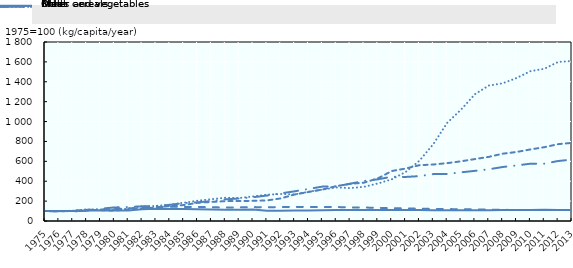
| Category | Rice | Other cereals | Meat | Fruits and vegetables | Milk |
|---|---|---|---|---|---|
| 1975.0 | 100 | 100 | 100 | 100 | 100 |
| 1976.0 | 99.717 | 100.924 | 97.703 | 97.95 | 101.478 |
| 1977.0 | 101.502 | 99.846 | 97.033 | 100.175 | 103.448 |
| 1978.0 | 106.602 | 113.177 | 103.541 | 109.499 | 117.241 |
| 1979.0 | 108.429 | 116.025 | 123.445 | 109.586 | 109.852 |
| 1980.0 | 106.757 | 121.367 | 136.268 | 104.399 | 114.778 |
| 1981.0 | 106.191 | 127.047 | 140.574 | 117.666 | 124.138 |
| 1982.0 | 119.04 | 132.466 | 147.847 | 122.538 | 145.32 |
| 1983.0 | 122.51 | 139.778 | 151.1 | 136.681 | 151.724 |
| 1984.0 | 121.632 | 143.504 | 162.297 | 150.456 | 164.039 |
| 1985.0 | 121.15 | 141.41 | 180.383 | 160.27 | 183.251 |
| 1986.0 | 118.785 | 141.21 | 187.56 | 183.246 | 203.941 |
| 1987.0 | 116.532 | 138.485 | 200.957 | 191.623 | 219.212 |
| 1988.0 | 113.614 | 135.422 | 218.182 | 199.597 | 233.99 |
| 1989.0 | 112.013 | 136.73 | 226.22 | 200.981 | 230.542 |
| 1990.0 | 115.824 | 139.763 | 238.852 | 202.489 | 247.291 |
| 1991.0 | 104.052 | 138.377 | 255.981 | 206.765 | 264.532 |
| 1992.0 | 104.236 | 140.302 | 277.512 | 227.234 | 271.429 |
| 1993.0 | 106.021 | 142.087 | 298.66 | 266.491 | 266.995 |
| 1994.0 | 106.403 | 141.241 | 322.297 | 291.781 | 294.581 |
| 1995.0 | 109.307 | 140.132 | 345.933 | 316.632 | 315.271 |
| 1996.0 | 109.789 | 140.81 | 348.517 | 350.403 | 337.438 |
| 1997.0 | 110.526 | 136.115 | 374.737 | 373.677 | 330.542 |
| 1998.0 | 111.234 | 135.468 | 402.775 | 385.717 | 343.842 |
| 1999.0 | 111.347 | 132.358 | 419.139 | 428.304 | 376.847 |
| 2000.0 | 111.404 | 128.448 | 445.072 | 502.313 | 419.212 |
| 2001.0 | 110.724 | 126.385 | 442.967 | 527.532 | 492.118 |
| 2002.0 | 110.044 | 124.153 | 451.292 | 561.199 | 606.404 |
| 2003.0 | 108.67 | 121.09 | 471.675 | 567.928 | 772.906 |
| 2004.0 | 108.103 | 119.797 | 472.823 | 581.861 | 987.192 |
| 2005.0 | 108.202 | 118.719 | 489.187 | 600.333 | 1120.197 |
| 2006.0 | 108.146 | 117.365 | 504.306 | 622.766 | 1274.877 |
| 2007.0 | 107.466 | 114.809 | 520.096 | 644.83 | 1362.069 |
| 2008.0 | 110.171 | 113.285 | 543.062 | 676.796 | 1384.236 |
| 2009.0 | 110.455 | 109.313 | 558.756 | 694.041 | 1437.931 |
| 2010.0 | 110.795 | 110.73 | 576.172 | 719.453 | 1506.404 |
| 2011.0 | 113.26 | 111.7 | 576.842 | 742.149 | 1530.542 |
| 2012.0 | 111.064 | 111.623 | 603.254 | 772.643 | 1599.015 |
| 2013.0 | 110.752 | 111.93 | 617.225 | 785.875 | 1608.867 |